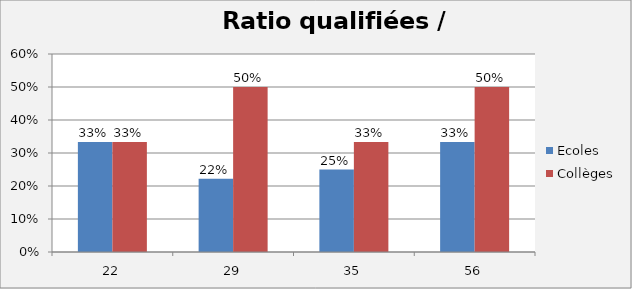
| Category | Ecoles | Collèges |
|---|---|---|
| 22.0 | 0.333 | 0.333 |
| 29.0 | 0.222 | 0.5 |
| 35.0 | 0.25 | 0.333 |
| 56.0 | 0.333 | 0.5 |